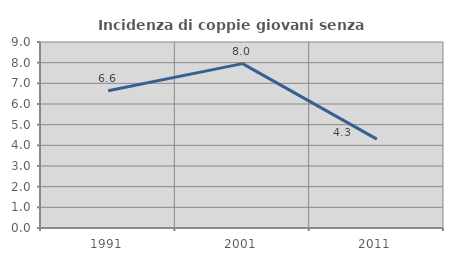
| Category | Incidenza di coppie giovani senza figli |
|---|---|
| 1991.0 | 6.641 |
| 2001.0 | 7.955 |
| 2011.0 | 4.3 |